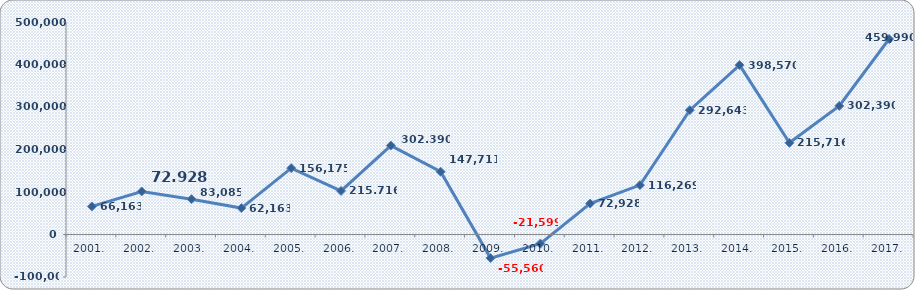
| Category | Dobit razdoblja (+) ili gubitak razdoblja (-)  |
|---|---|
| 2001. | 66163 |
| 2002. | 101214 |
| 2003. | 83085 |
| 2004. | 62163 |
| 2005. | 156175 |
| 2006. | 102458 |
| 2007. | 209287 |
| 2008. | 147711 |
| 2009. | -55560 |
| 2010. | -21599 |
| 2011. | 72928 |
| 2012. | 116269 |
| 2013. | 292643 |
| 2014. | 398570 |
| 2015. | 215716 |
| 2016. | 302390 |
| 2017. | 459989.953 |